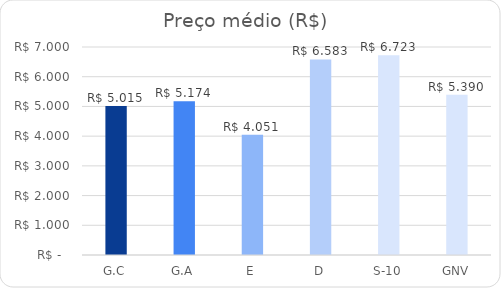
| Category | Series 0 |
|---|---|
| G.C | 5.015 |
| G.A | 5.174 |
| E | 4.051 |
| D | 6.583 |
| S-10 | 6.723 |
| GNV | 5.39 |